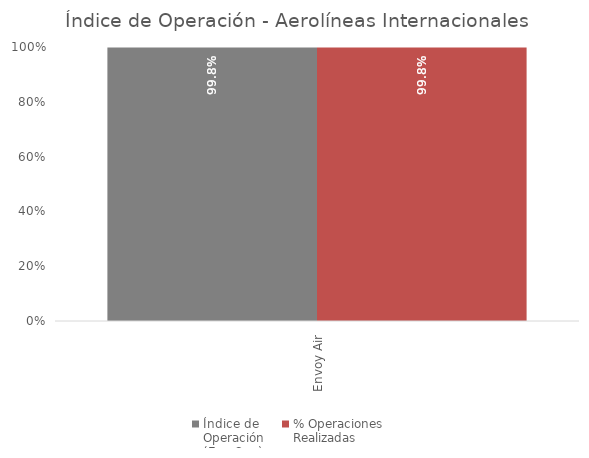
| Category | Índice de 
Operación
(Ene-Sep) | % Operaciones
Realizadas |
|---|---|---|
| Envoy Air | 0.998 | 0.998 |